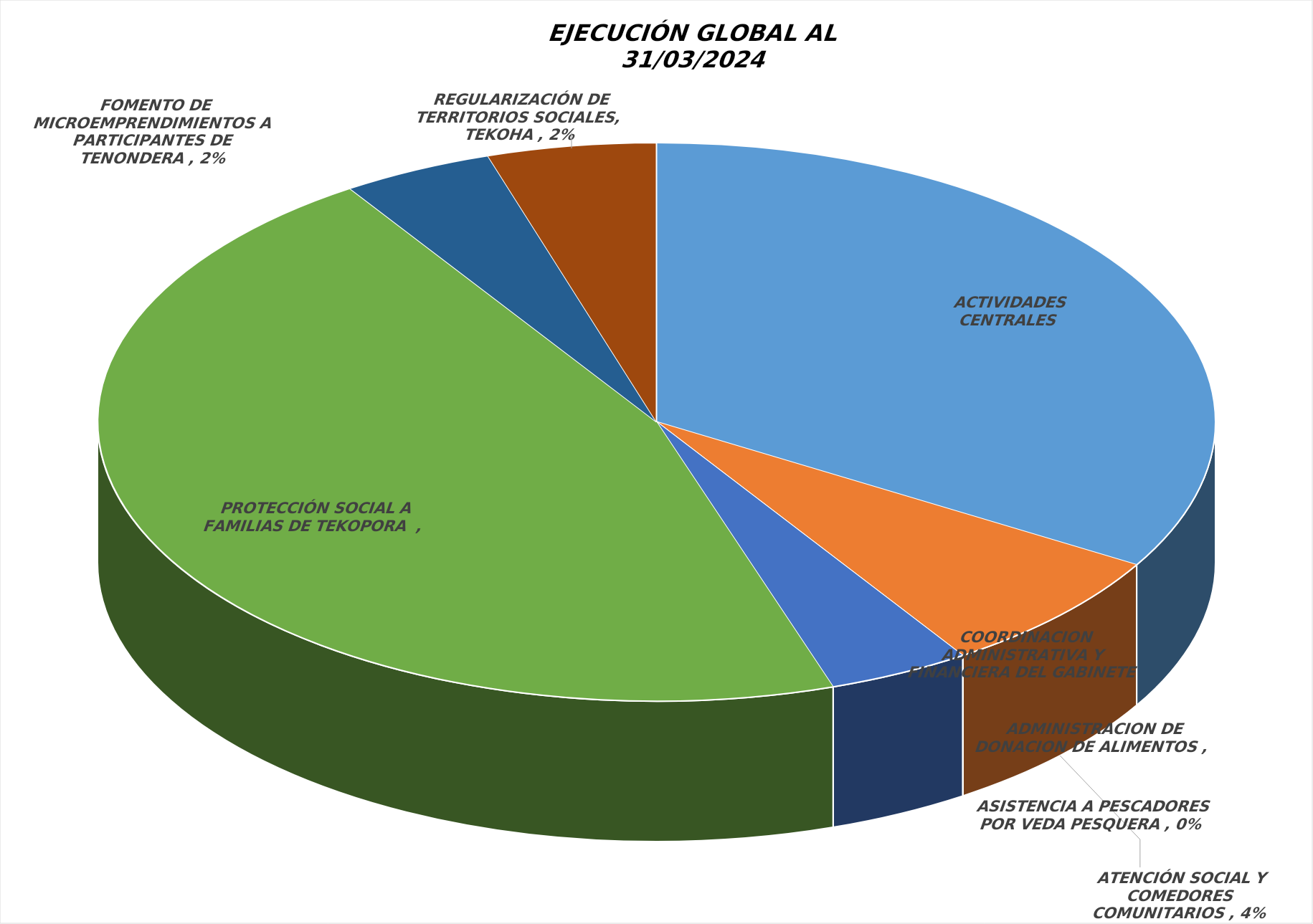
| Category | Series 0 |
|---|---|
|  ACTIVIDADES CENTRALES ADMINISTRATIVAS  | 0.163 |
|  ATENCIÓN SOCIAL Y COMEDORES COMUNITARIOS  | 0.035 |
|  ASISTENCIA A PESCADORES POR VEDA PESQUERA  | 0 |
|  ADMINISTRACION DE DONACION DE ALIMENTOS  | 0 |
|  COORDINACION ADMINISTRATIVA Y FINANCIERA DEL GABINETE SOCIAL   | 0.02 |
|  PROTECCIÓN SOCIAL A FAMILIAS DE TEKOPORA   | 0.223 |
|  FOMENTO DE MICROEMPRENDIMIENTOS A PARTICIPANTES DE TENONDERA  | 0.021 |
|  REGULARIZACIÓN DE TERRITORIOS SOCIALES, TEKOHA  | 0.024 |